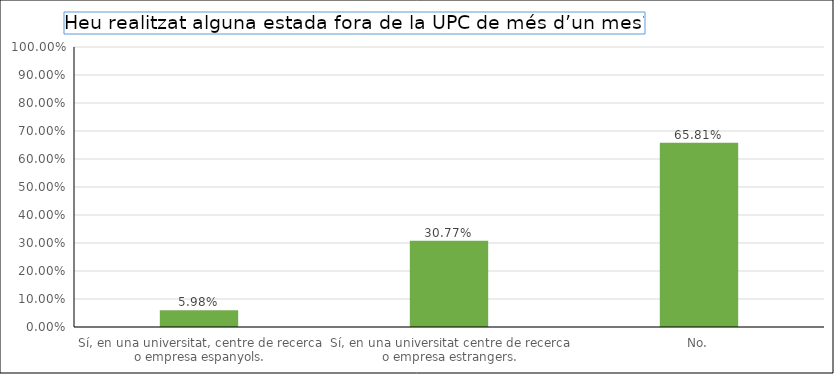
| Category | Series 0 |
|---|---|
| Sí, en una universitat, centre de recerca o empresa espanyols. | 0.06 |
| Sí, en una universitat centre de recerca o empresa estrangers. | 0.308 |
| No. | 0.658 |